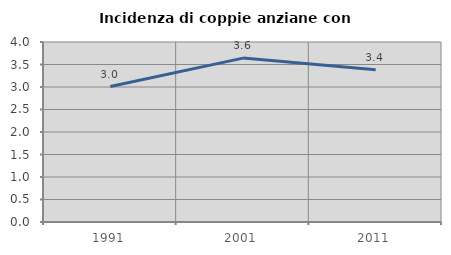
| Category | Incidenza di coppie anziane con figli |
|---|---|
| 1991.0 | 3.01 |
| 2001.0 | 3.642 |
| 2011.0 | 3.381 |